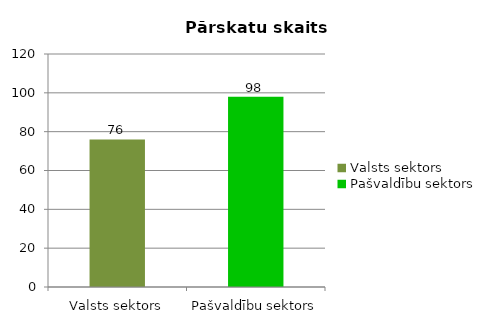
| Category |  Pārskatu skaits |
|---|---|
| Valsts sektors | 76 |
| Pašvaldību sektors | 98 |